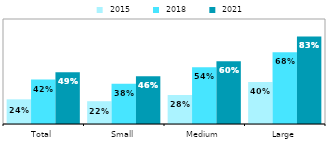
| Category |  2015 |  2018 |  2021 |
|---|---|---|---|
| Total | 0.235 | 0.423 | 0.494 |
| Small | 0.217 | 0.384 | 0.455 |
| Medium | 0.276 | 0.54 | 0.598 |
| Large | 0.399 | 0.684 | 0.834 |